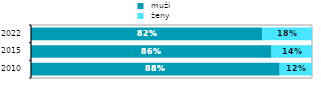
| Category |  muži |  ženy |
|---|---|---|
| 2010.0 | 0.885 | 0.115 |
| 2015.0 | 0.856 | 0.144 |
| 2022.0 | 0.822 | 0.178 |